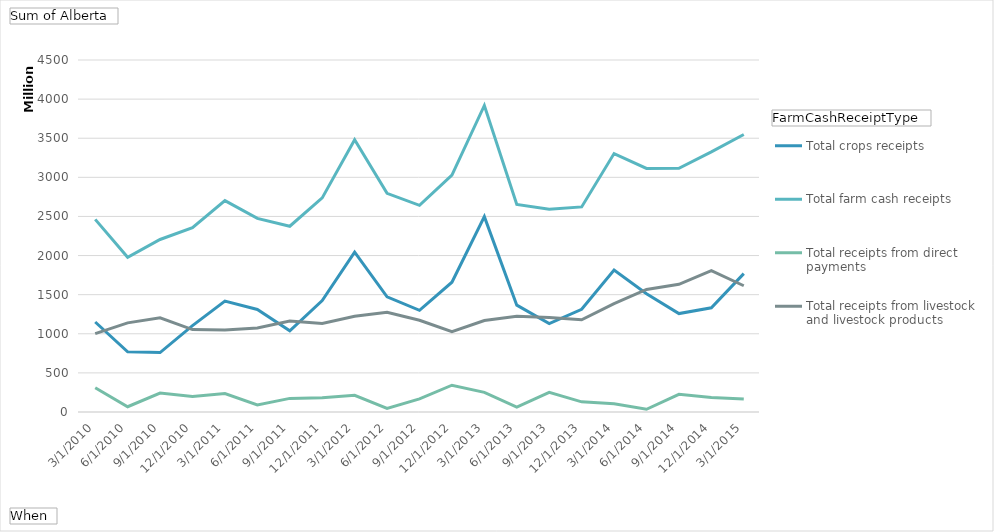
| Category | Total crops receipts | Total farm cash receipts | Total receipts from direct payments | Total receipts from livestock and livestock products |
|---|---|---|---|---|
| 3/1/2010 | 1150575000 | 2462546000 | 310505000 | 1001466000 |
| 6/1/2010 | 769728000 | 1977150000 | 67566000 | 1139856000 |
| 9/1/2010 | 759583000 | 2205468000 | 241307000 | 1204579000 |
| 12/1/2010 | 1104378000 | 2355752000 | 197521000 | 1053853000 |
| 3/1/2011 | 1416922000 | 2702498000 | 235790000 | 1049786000 |
| 6/1/2011 | 1310652000 | 2474987000 | 89032000 | 1075303000 |
| 9/1/2011 | 1037547000 | 2374763000 | 174013000 | 1163202000 |
| 12/1/2011 | 1423930000 | 2737194000 | 182481000 | 1130783000 |
| 3/1/2012 | 2044570000 | 3481674000 | 214137000 | 1222966000 |
| 6/1/2012 | 1472414000 | 2794776000 | 46876000 | 1275486000 |
| 9/1/2012 | 1300051000 | 2641459000 | 168106000 | 1173302000 |
| 12/1/2012 | 1659178000 | 3027919000 | 342487000 | 1026254000 |
| 3/1/2013 | 2497236000 | 3918765000 | 251407000 | 1170122000 |
| 6/1/2013 | 1366001000 | 2652935000 | 62873000 | 1224061000 |
| 9/1/2013 | 1129807000 | 2590761000 | 252230000 | 1208724000 |
| 12/1/2013 | 1312879000 | 2621640000 | 129852000 | 1178909000 |
| 3/1/2014 | 1814743000 | 3304017000 | 104282000 | 1384992000 |
| 6/1/2014 | 1511094000 | 3113266000 | 34860000 | 1567311000 |
| 9/1/2014 | 1258525000 | 3115963000 | 225446000 | 1631992000 |
| 12/1/2014 | 1332771000 | 3325322000 | 184686000 | 1807865000 |
| 3/1/2015 | 1768732000 | 3547320000 | 164674000 | 1613914000 |